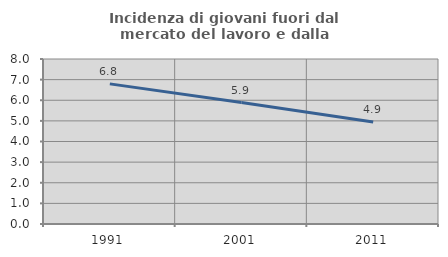
| Category | Incidenza di giovani fuori dal mercato del lavoro e dalla formazione  |
|---|---|
| 1991.0 | 6.794 |
| 2001.0 | 5.886 |
| 2011.0 | 4.942 |